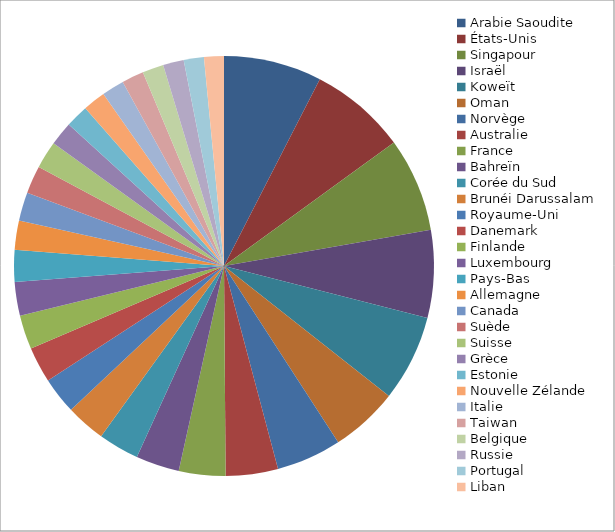
| Category | Series 0 |
|---|---|
| Arabie Saoudite | 2004.603 |
| États-Unis | 1983.076 |
| Singapour | 1922.614 |
| Israël | 1795.065 |
| Koweït | 1763.465 |
| Oman | 1389.383 |
| Norvège | 1329.799 |
| Australie | 1068.806 |
| France | 952.42 |
| Bahreïn | 890.127 |
| Corée du Sud | 834.12 |
| Brunéi Darussalam | 808.929 |
| Royaume-Uni | 751.959 |
| Danemark | 729.287 |
| Finlande | 697.529 |
| Luxembourg | 689.453 |
| Pays-Bas | 652.486 |
| Allemagne | 596.554 |
| Canada | 583.423 |
| Suède | 565.148 |
| Suisse | 563.139 |
| Grèce | 487.245 |
| Estonie | 467.868 |
| Nouvelle Zélande | 463.207 |
| Italie | 460.159 |
| Taiwan | 450.547 |
| Belgique | 434.247 |
| Russie | 424.895 |
| Portugal | 413.159 |
| Liban | 405.319 |